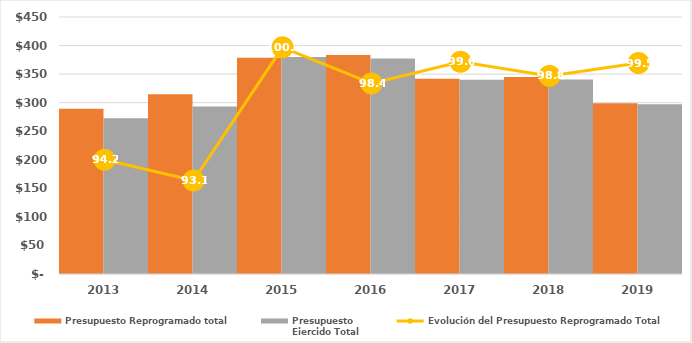
| Category | Presupuesto Reprogramado total | Presupuesto
Ejercido Total |
|---|---|---|
| 2013.0 | 289428.733 | 272702.822 |
| 2014.0 | 314864.8 | 293113.7 |
| 2015.0 | 378700.3 | 380021.6 |
| 2016.0 | 383632 | 377416.6 |
| 2017.0 | 341839.2 | 340334.7 |
| 2018.0 | 344938.7 | 340765 |
| 2019.0 | 298904.428 | 297383.7 |